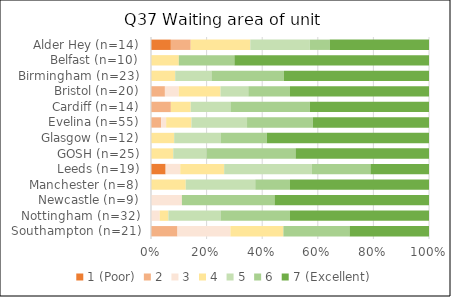
| Category | 1 (Poor) | 2 | 3 | 4 | 5 | 6 | 7 (Excellent) |
|---|---|---|---|---|---|---|---|
| Southampton (n=21) | 0 | 2 | 4 | 4 | 0 | 5 | 6 |
| Nottingham (n=32) | 0 | 0 | 1 | 1 | 6 | 8 | 16 |
| Newcastle (n=9) | 0 | 0 | 1 | 0 | 0 | 3 | 5 |
| Manchester (n=8) | 0 | 0 | 0 | 1 | 2 | 1 | 4 |
| Leeds (n=19) | 1 | 0 | 1 | 3 | 6 | 4 | 4 |
| GOSH (n=25) | 0 | 0 | 0 | 2 | 3 | 8 | 12 |
| Glasgow (n=12) | 0 | 0 | 0 | 1 | 2 | 2 | 7 |
| Evelina (n=55) | 0 | 2 | 1 | 5 | 11 | 13 | 23 |
| Cardiff (n=14) | 0 | 1 | 0 | 1 | 2 | 4 | 6 |
| Bristol (n=20) | 0 | 1 | 1 | 3 | 2 | 3 | 10 |
| Birmingham (n=23) | 0 | 0 | 0 | 2 | 3 | 6 | 12 |
| Belfast (n=10) | 0 | 0 | 0 | 1 | 0 | 2 | 7 |
| Alder Hey (n=14) | 1 | 1 | 0 | 3 | 3 | 1 | 5 |